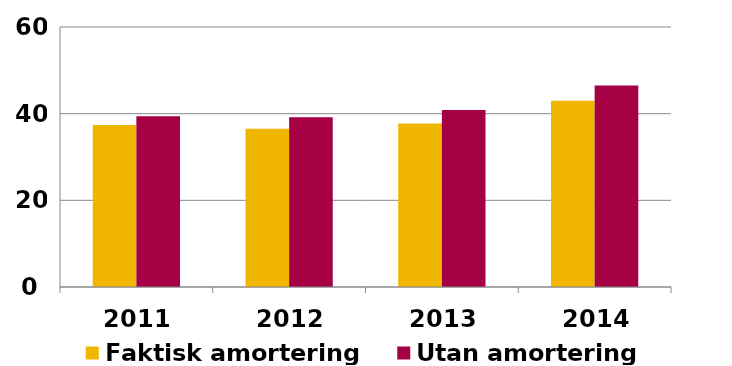
| Category | Faktisk amortering | Utan amortering |
|---|---|---|
| 2011.0 | 37.368 | 39.378 |
| 2012.0 | 36.501 | 39.196 |
| 2013.0 | 37.742 | 40.85 |
| 2014.0 | 42.973 | 46.497 |